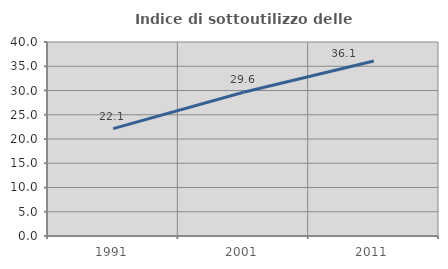
| Category | Indice di sottoutilizzo delle abitazioni  |
|---|---|
| 1991.0 | 22.137 |
| 2001.0 | 29.641 |
| 2011.0 | 36.096 |